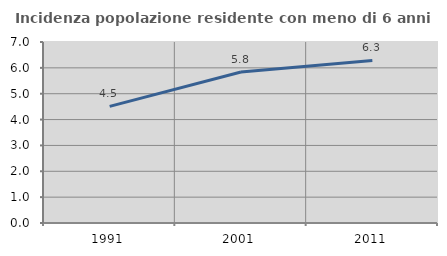
| Category | Incidenza popolazione residente con meno di 6 anni |
|---|---|
| 1991.0 | 4.51 |
| 2001.0 | 5.838 |
| 2011.0 | 6.288 |